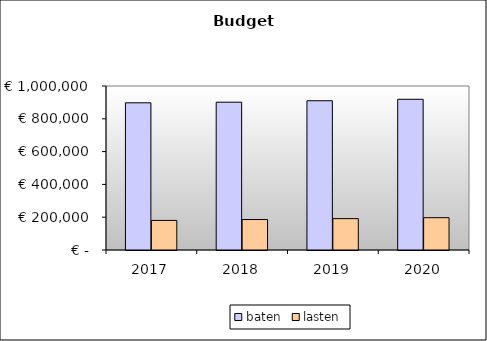
| Category | baten | lasten |
|---|---|---|
| 2017.0 | 897486.41 | 180384.893 |
| 2018.0 | 901207.41 | 185774.629 |
| 2019.0 | 910137.81 | 191279.837 |
| 2020.0 | 919068.21 | 196851.646 |